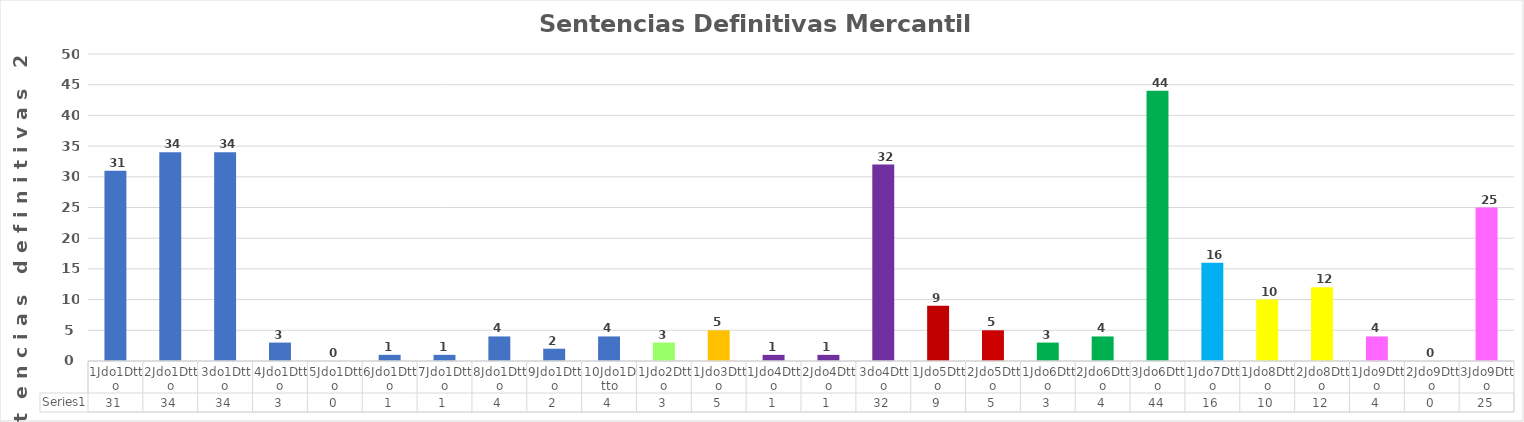
| Category | Series 0 |
|---|---|
| 1Jdo1Dtto | 31 |
| 2Jdo1Dtto | 34 |
| 3do1Dtto | 34 |
| 4Jdo1Dtto | 3 |
| 5Jdo1Dtto | 0 |
| 6Jdo1Dtto | 1 |
| 7Jdo1Dtto | 1 |
| 8Jdo1Dtto | 4 |
| 9Jdo1Dtto | 2 |
| 10Jdo1Dtto | 4 |
| 1Jdo2Dtto | 3 |
| 1Jdo3Dtto | 5 |
| 1Jdo4Dtto | 1 |
| 2Jdo4Dtto | 1 |
| 3do4Dtto | 32 |
| 1Jdo5Dtto | 9 |
| 2Jdo5Dtto | 5 |
| 1Jdo6Dtto | 3 |
| 2Jdo6Dtto | 4 |
| 3Jdo6Dtto | 44 |
| 1Jdo7Dtto | 16 |
| 1Jdo8Dtto | 10 |
| 2Jdo8Dtto | 12 |
| 1Jdo9Dtto | 4 |
| 2Jdo9Dtto | 0 |
| 3Jdo9Dtto | 25 |